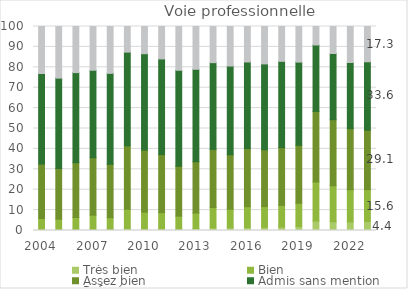
| Category | Très bien | Bien | Assez bien | Admis sans mention | Refusé |
|---|---|---|---|---|---|
| 2004 | 0.384 | 5.482 | 26.683 | 44.416 | 23.035 |
| 2005 | 0.363 | 5.18 | 24.837 | 44.321 | 25.299 |
| 2006 | 0.483 | 5.907 | 26.846 | 44.176 | 22.588 |
| 2007 | 0.564 | 6.953 | 28.145 | 42.885 | 21.453 |
| 2008 | 0.461 | 5.84 | 26.153 | 44.58 | 22.966 |
| 2009 | 0.902 | 9.539 | 31.054 | 45.95 | 12.555 |
| 2010 | 0.742 | 8.237 | 30.431 | 47.256 | 13.334 |
| 2011 | 0.742 | 8.003 | 28.438 | 46.933 | 15.885 |
| 2012 | 0.633 | 6.43 | 24.421 | 47.059 | 21.457 |
| 2013 | 0.94 | 7.603 | 25.131 | 45.355 | 20.971 |
| 2014 | 1.289 | 9.977 | 28.462 | 42.552 | 17.721 |
| 2015 | 1.326 | 9.103 | 26.702 | 43.486 | 19.383 |
| 2016 | 1.447 | 10.217 | 28.509 | 42.443 | 17.384 |
| 2017 | 1.597 | 10.12 | 27.848 | 42.097 | 18.338 |
| 2018 | 1.728 | 10.596 | 28.31 | 42.294 | 17.072 |
| 2019 | 2.037 | 11.318 | 28.376 | 40.82 | 17.449 |
| 2020 | 4.6 | 19.185 | 34.591 | 32.571 | 9.053 |
| 2021 | 4.31 | 17.656 | 32.349 | 32.446 | 13.24 |
| 2022 | 4.164 | 15.82 | 29.953 | 32.418 | 17.646 |
| 2023p | 4.407 | 15.62 | 29.129 | 33.552 | 17.292 |